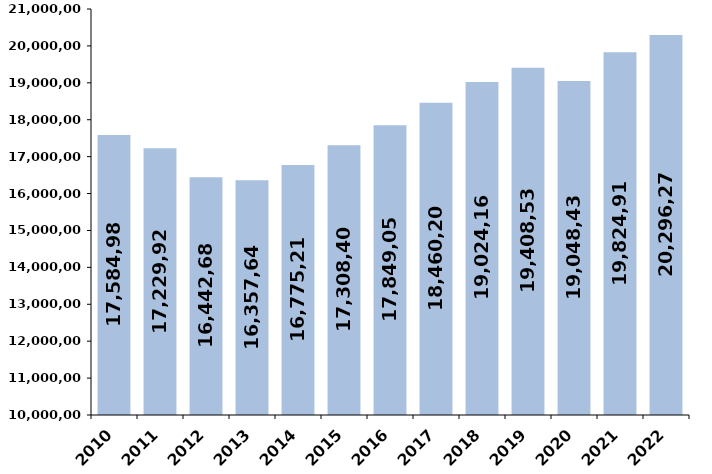
| Category | % de variación
 interanual |
|---|---|
| 2010 | 17584981.63 |
| 2011 | 17229921.5 |
| 2012 | 16442681.23 |
| 2013 | 16357640.05 |
| 2014 | 16775214.47 |
| 2015 | 17308400 |
| 2016 | 17849054.5 |
| 2017 | 18460200.52 |
| 2018 | 19024165.17 |
| 2019 | 19408537.83 |
| 2020 | 19048433 |
| 2021 | 19824911 |
| 2022 | 20296270.9 |